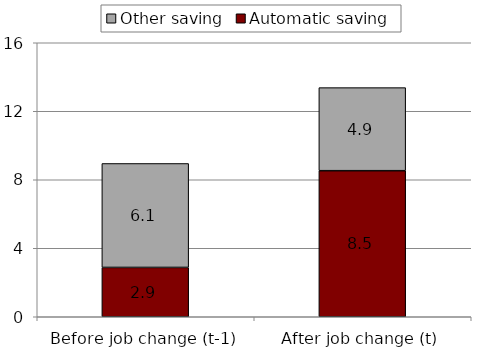
| Category | Automatic saving | Other saving |
|---|---|---|
| Before job change (t-1) | 2.88 | 6.07 |
| After job change (t) | 8.53 | 4.85 |